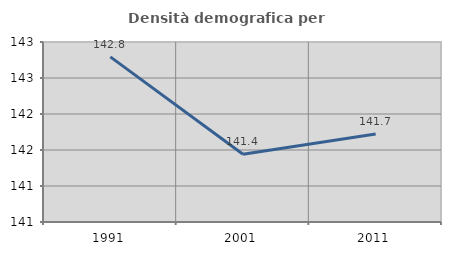
| Category | Densità demografica |
|---|---|
| 1991.0 | 142.793 |
| 2001.0 | 141.44 |
| 2011.0 | 141.723 |